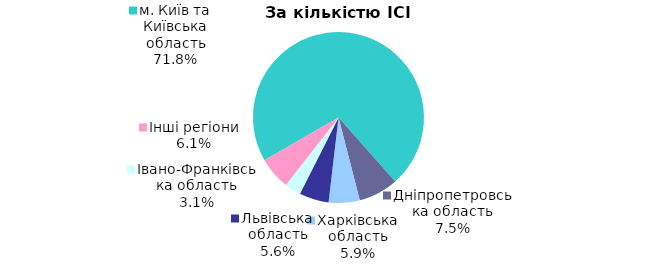
| Category | Series 0 |
|---|---|
| м. Київ та Київська область | 0.718 |
| Дніпропетровська область | 0.075 |
| Харківська область | 0.059 |
| Львівська область | 0.056 |
| Iвано-Франкiвська область | 0.031 |
| Інші регіони | 0.061 |